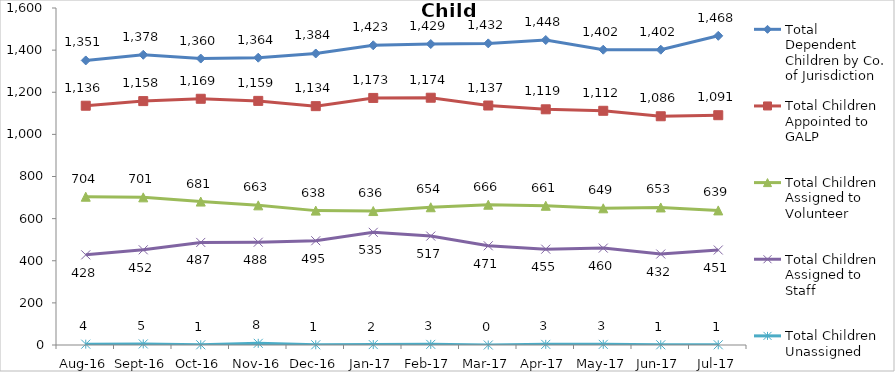
| Category | Total Dependent Children by Co. of Jurisdiction | Total Children Appointed to GALP | Total Children Assigned to Volunteer | Total Children Assigned to Staff | Total Children Unassigned |
|---|---|---|---|---|---|
| Aug-16 | 1351 | 1136 | 704 | 428 | 4 |
| Sep-16 | 1378 | 1158 | 701 | 452 | 5 |
| Oct-16 | 1360 | 1169 | 681 | 487 | 1 |
| Nov-16 | 1364 | 1159 | 663 | 488 | 8 |
| Dec-16 | 1384 | 1134 | 638 | 495 | 1 |
| Jan-17 | 1423 | 1173 | 636 | 535 | 2 |
| Feb-17 | 1429 | 1174 | 654 | 517 | 3 |
| Mar-17 | 1432 | 1137 | 666 | 471 | 0 |
| Apr-17 | 1448 | 1119 | 661 | 455 | 3 |
| May-17 | 1402 | 1112 | 649 | 460 | 3 |
| Jun-17 | 1402 | 1086 | 653 | 432 | 1 |
| Jul-17 | 1468 | 1091 | 639 | 451 | 1 |